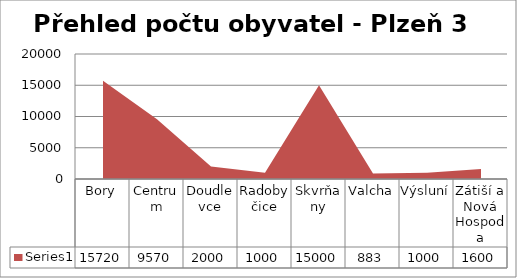
| Category | Series 0 |
|---|---|
| Bory | 15720 |
| Centrum | 9570 |
| Doudlevce | 2000 |
| Radobyčice | 1000 |
| Skvrňany | 15000 |
| Valcha | 883 |
| Výsluní | 1000 |
| Zátiší a Nová Hospoda | 1600 |